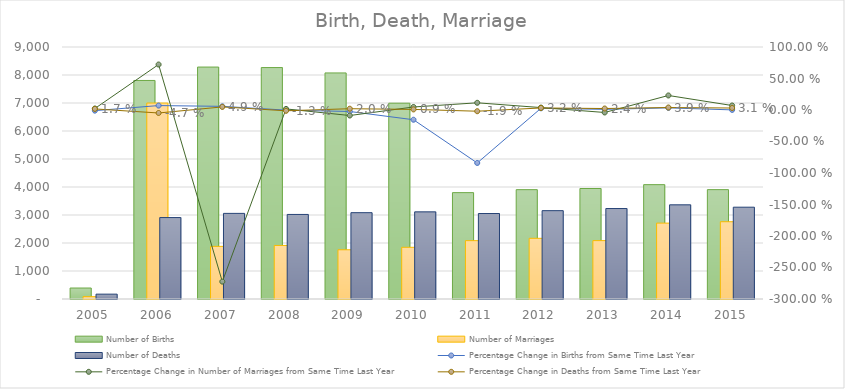
| Category | Number of Births | Number of Marriages | Number of Deaths |
|---|---|---|---|
| 2005 | 392 | 84 | 173 |
| 2006 | 7805 | 6998 | 2908 |
| 2007 | 8284 | 1879 | 3058 |
| 2008 | 8266 | 1912 | 3020 |
| 2009 | 8074 | 1758 | 3083 |
| 2010 | 6993 | 1846 | 3112 |
| 2011 | 3799 | 2084 | 3053 |
| 2012 | 3905 | 2167 | 3155 |
| 2013 | 3946 | 2085 | 3231 |
| 2014 | 4084 | 2710 | 3363 |
| 2015 | 3906 | 2760 | 3279 |